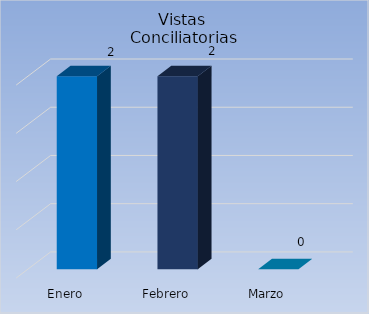
| Category | Vistas 
Conciliato-rias |
|---|---|
| Enero | 2 |
| Febrero | 2 |
| Marzo | 0 |